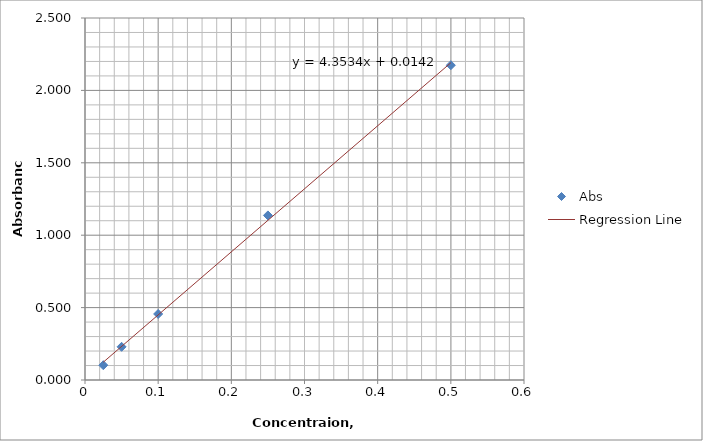
| Category | Abs |
|---|---|
| 0.5 | 2.174 |
| 0.25 | 1.137 |
| 0.1 | 0.456 |
| 0.05 | 0.229 |
| 0.025 | 0.102 |